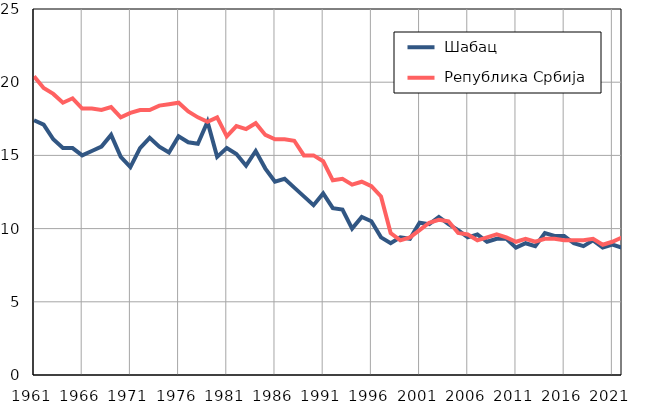
| Category |  Шабац |  Република Србија |
|---|---|---|
| 1961.0 | 17.4 | 20.4 |
| 1962.0 | 17.1 | 19.6 |
| 1963.0 | 16.1 | 19.2 |
| 1964.0 | 15.5 | 18.6 |
| 1965.0 | 15.5 | 18.9 |
| 1966.0 | 15 | 18.2 |
| 1967.0 | 15.3 | 18.2 |
| 1968.0 | 15.6 | 18.1 |
| 1969.0 | 16.4 | 18.3 |
| 1970.0 | 14.9 | 17.6 |
| 1971.0 | 14.2 | 17.9 |
| 1972.0 | 15.5 | 18.1 |
| 1973.0 | 16.2 | 18.1 |
| 1974.0 | 15.6 | 18.4 |
| 1975.0 | 15.2 | 18.5 |
| 1976.0 | 16.3 | 18.6 |
| 1977.0 | 15.9 | 18 |
| 1978.0 | 15.8 | 17.6 |
| 1979.0 | 17.3 | 17.3 |
| 1980.0 | 14.9 | 17.6 |
| 1981.0 | 15.5 | 16.3 |
| 1982.0 | 15.1 | 17 |
| 1983.0 | 14.3 | 16.8 |
| 1984.0 | 15.3 | 17.2 |
| 1985.0 | 14.1 | 16.4 |
| 1986.0 | 13.2 | 16.1 |
| 1987.0 | 13.4 | 16.1 |
| 1988.0 | 12.8 | 16 |
| 1989.0 | 12.2 | 15 |
| 1990.0 | 11.6 | 15 |
| 1991.0 | 12.4 | 14.6 |
| 1992.0 | 11.4 | 13.3 |
| 1993.0 | 11.3 | 13.4 |
| 1994.0 | 10 | 13 |
| 1995.0 | 10.8 | 13.2 |
| 1996.0 | 10.5 | 12.9 |
| 1997.0 | 9.4 | 12.2 |
| 1998.0 | 9 | 9.7 |
| 1999.0 | 9.4 | 9.2 |
| 2000.0 | 9.3 | 9.4 |
| 2001.0 | 10.4 | 9.9 |
| 2002.0 | 10.3 | 10.4 |
| 2003.0 | 10.8 | 10.6 |
| 2004.0 | 10.3 | 10.5 |
| 2005.0 | 9.9 | 9.7 |
| 2006.0 | 9.4 | 9.6 |
| 2007.0 | 9.6 | 9.2 |
| 2008.0 | 9.1 | 9.4 |
| 2009.0 | 9.3 | 9.6 |
| 2010.0 | 9.3 | 9.4 |
| 2011.0 | 8.7 | 9.1 |
| 2012.0 | 9 | 9.3 |
| 2013.0 | 8.8 | 9.1 |
| 2014.0 | 9.7 | 9.3 |
| 2015.0 | 9.5 | 9.3 |
| 2016.0 | 9.5 | 9.2 |
| 2017.0 | 9 | 9.2 |
| 2018.0 | 8.8 | 9.2 |
| 2019.0 | 9.2 | 9.3 |
| 2020.0 | 8.7 | 8.9 |
| 2021.0 | 8.9 | 9.1 |
| 2022.0 | 8.7 | 9.4 |